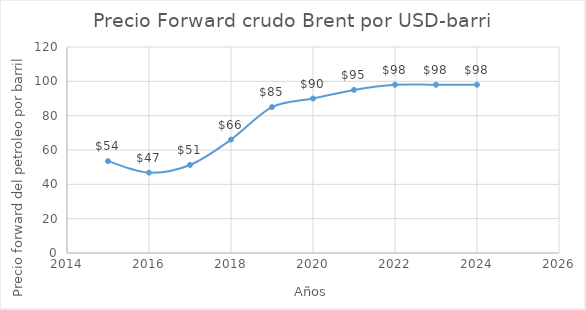
| Category | Series 0 |
|---|---|
| 2015.0 | 53.5 |
| 2016.0 | 46.805 |
| 2017.0 | 51.285 |
| 2018.0 | 66.035 |
| 2019.0 | 85 |
| 2020.0 | 90 |
| 2021.0 | 95 |
| 2022.0 | 98 |
| 2023.0 | 98 |
| 2024.0 | 98 |